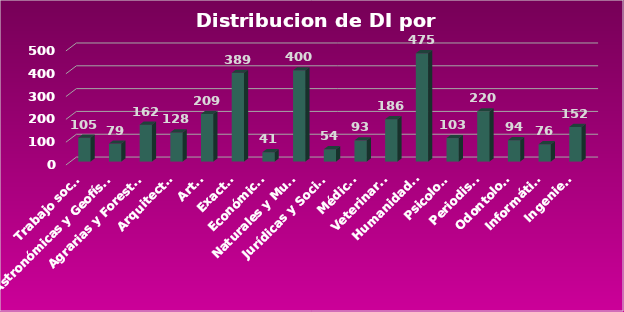
| Category | Series 0 |
|---|---|
| Trabajo social | 105 |
| Astronómicas y Geofísicas | 79 |
| Agrarias y Forestales | 162 |
| Arquitectura | 128 |
| Artes | 209 |
| Exactas | 389 |
| Económicas | 41 |
| Naturales y Museo | 400 |
| Jurídicas y Sociales | 54 |
| Médicas | 93 |
| Veterinarias | 186 |
| Humanidades | 475 |
| Psicología | 103 |
| Periodismo | 220 |
| Odontología | 94 |
| Informática | 76 |
| Ingeniería | 152 |